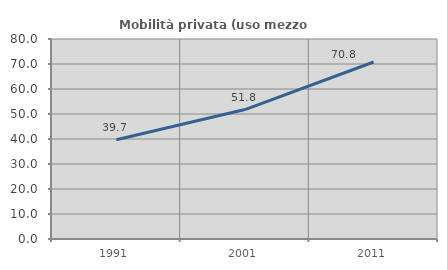
| Category | Mobilità privata (uso mezzo privato) |
|---|---|
| 1991.0 | 39.686 |
| 2001.0 | 51.786 |
| 2011.0 | 70.812 |